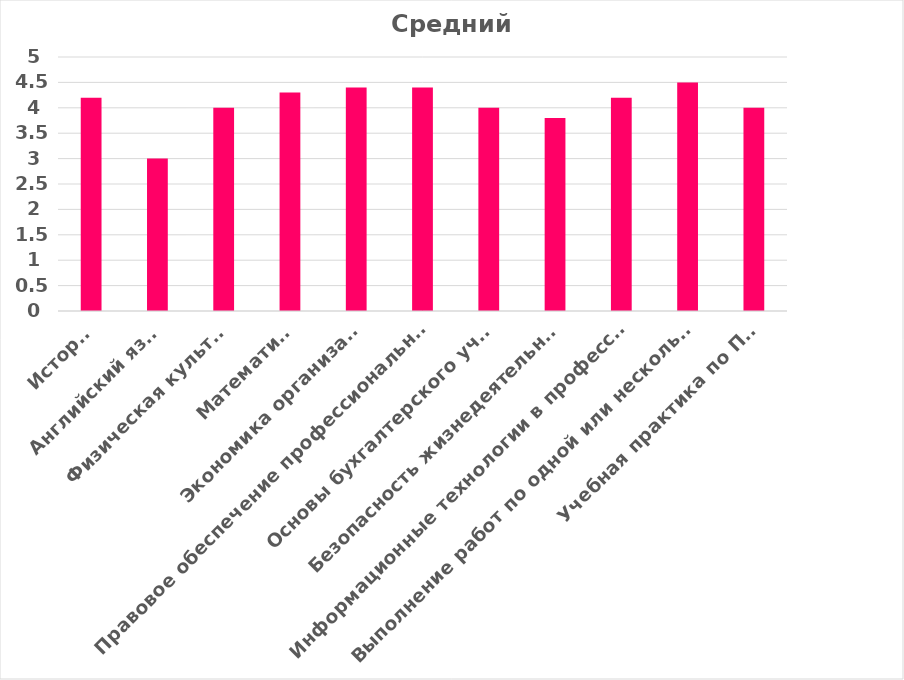
| Category | Средний балл |
|---|---|
| История | 4.2 |
| Английский язык | 3 |
| Физическая культура | 4 |
| Математика | 4.3 |
| Экономика организации | 4.4 |
| Правовое обеспечение профессиональной деятельности | 4.4 |
| Основы бухгалтерского учета | 4 |
| Безопасность жизнедеятельности | 3.8 |
| Информационные технологии в профессиональной деятельности | 4.2 |
| Выполнение работ по одной или нескольким профессиям рабочих, должностям служащих | 4.5 |
| Учебная практика по ПМ.05 | 4 |